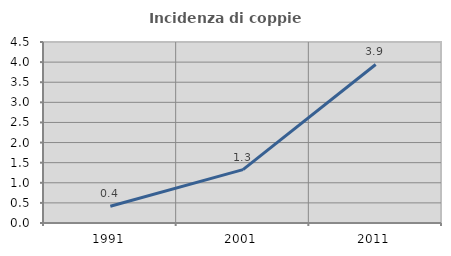
| Category | Incidenza di coppie miste |
|---|---|
| 1991.0 | 0.415 |
| 2001.0 | 1.326 |
| 2011.0 | 3.941 |